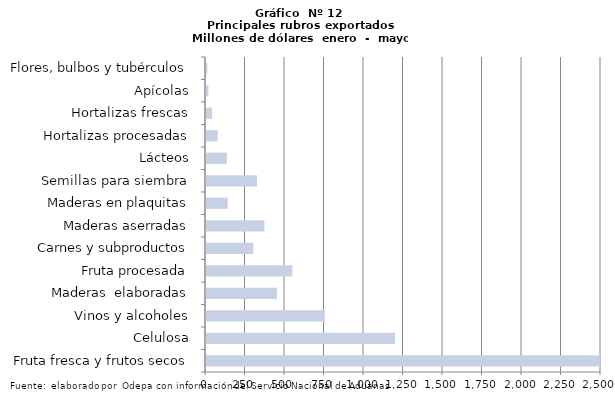
| Category | Series 7 |
|---|---|
| Fruta fresca y frutos secos | 2515192.338 |
| Celulosa | 1196411.664 |
| Vinos y alcoholes | 751904.945 |
| Maderas  elaboradas | 448919.23 |
| Fruta procesada | 546520.614 |
| Carnes y subproductos | 299650.413 |
| Maderas aserradas | 369297.858 |
| Maderas en plaquitas | 137257.23 |
| Semillas para siembra | 323051.158 |
| Lácteos | 132363.574 |
| Hortalizas procesadas | 74014.805 |
| Hortalizas frescas | 38805.726 |
| Apícolas | 15400.417 |
| Flores, bulbos y tubérculos | 8376.911 |